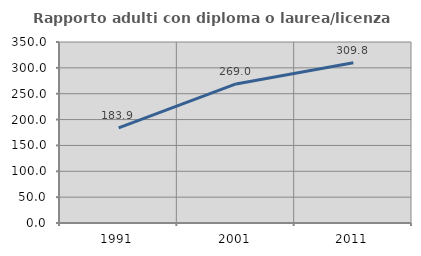
| Category | Rapporto adulti con diploma o laurea/licenza media  |
|---|---|
| 1991.0 | 183.911 |
| 2001.0 | 268.98 |
| 2011.0 | 309.836 |